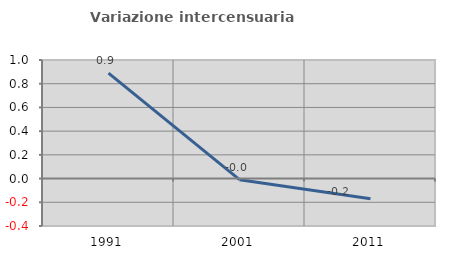
| Category | Variazione intercensuaria annua |
|---|---|
| 1991.0 | 0.889 |
| 2001.0 | -0.009 |
| 2011.0 | -0.17 |